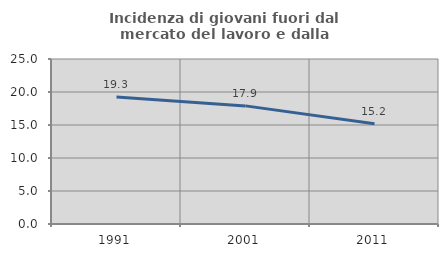
| Category | Incidenza di giovani fuori dal mercato del lavoro e dalla formazione  |
|---|---|
| 1991.0 | 19.256 |
| 2001.0 | 17.897 |
| 2011.0 | 15.187 |